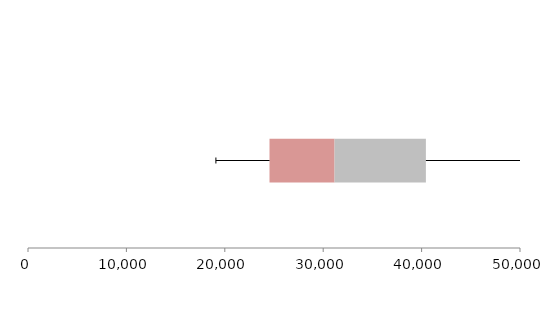
| Category | Series 1 | Series 2 | Series 3 |
|---|---|---|---|
| 0 | 24543.112 | 6611.939 | 9281.64 |